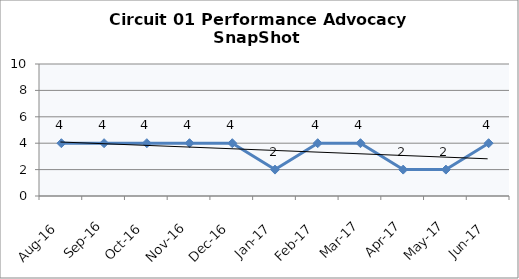
| Category | Circuit 01 |
|---|---|
| Aug-16 | 4 |
| Sep-16 | 4 |
| Oct-16 | 4 |
| Nov-16 | 4 |
| Dec-16 | 4 |
| Jan-17 | 2 |
| Feb-17 | 4 |
| Mar-17 | 4 |
| Apr-17 | 2 |
| May-17 | 2 |
| Jun-17 | 4 |